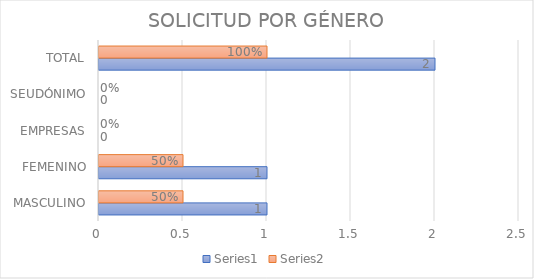
| Category | Series 0 | Series 1 |
|---|---|---|
| MASCULINO | 1 | 0.5 |
| FEMENINO | 1 | 0.5 |
| EMPRESAS | 0 | 0 |
| SEUDÓNIMO | 0 | 0 |
| TOTAL | 2 | 1 |